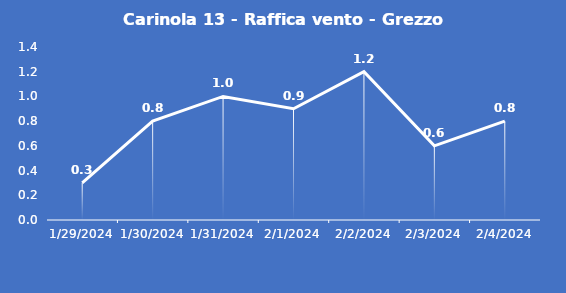
| Category | Carinola 13 - Raffica vento - Grezzo (m/s) |
|---|---|
| 1/29/24 | 0.3 |
| 1/30/24 | 0.8 |
| 1/31/24 | 1 |
| 2/1/24 | 0.9 |
| 2/2/24 | 1.2 |
| 2/3/24 | 0.6 |
| 2/4/24 | 0.8 |